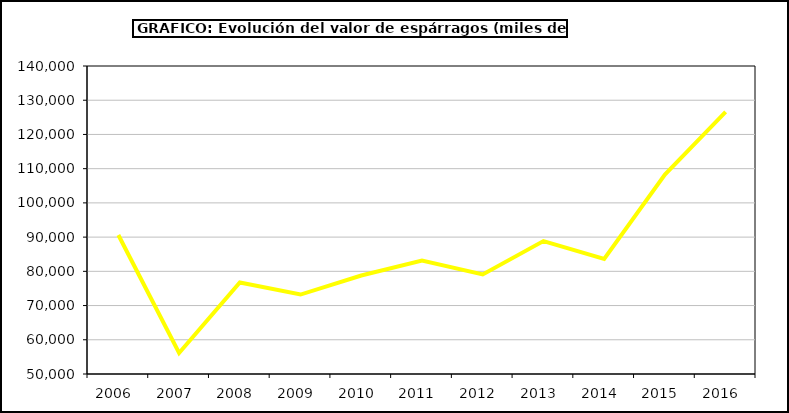
| Category | Valor |
|---|---|
| 2006.0 | 90627.383 |
| 2007.0 | 56130.977 |
| 2008.0 | 76743.638 |
| 2009.0 | 73215.082 |
| 2010.0 | 78781.277 |
| 2011.0 | 83128.666 |
| 2012.0 | 79103.985 |
| 2013.0 | 88833.6 |
| 2014.0 | 83613.501 |
| 2015.0 | 108300 |
| 2016.0 | 126575 |